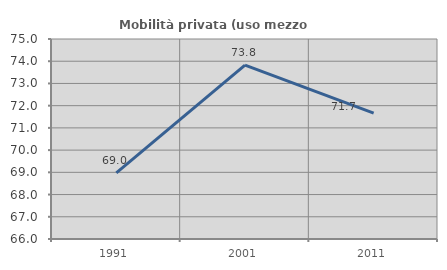
| Category | Mobilità privata (uso mezzo privato) |
|---|---|
| 1991.0 | 68.979 |
| 2001.0 | 73.828 |
| 2011.0 | 71.667 |